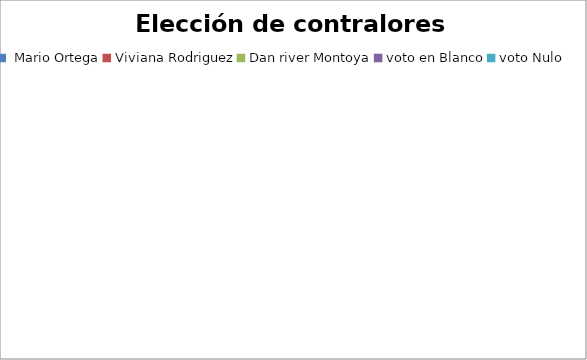
| Category | Series 0 |
|---|---|
|  Mario Ortega | 0 |
| Viviana Rodriguez | 0 |
| Dan river Montoya | 0 |
| voto en Blanco | 0 |
| voto Nulo | 0 |